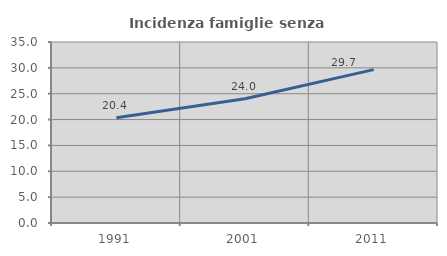
| Category | Incidenza famiglie senza nuclei |
|---|---|
| 1991.0 | 20.35 |
| 2001.0 | 24.026 |
| 2011.0 | 29.656 |